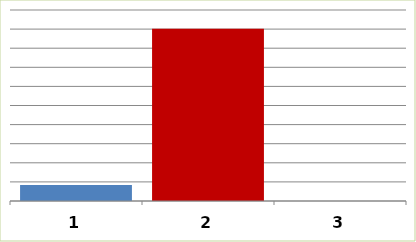
| Category | Series 0 |
|---|---|
| 0 | 1683350 |
| 1 | 18032678 |
| 2 | 0 |